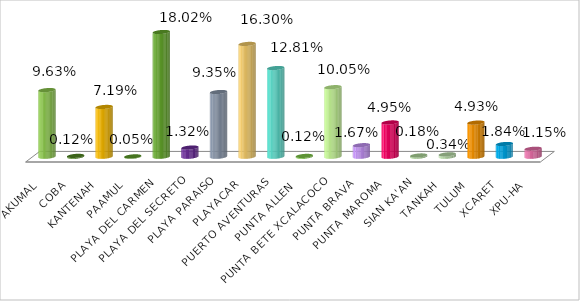
| Category | INVENTARIO DE ESTABLECIMIENTOS DE HOSPEDAJE |
|---|---|
| AKUMAL | 0.096 |
| COBA | 0.001 |
| KANTENAH | 0.072 |
| PAAMUL | 0 |
| PLAYA DEL CARMEN | 0.18 |
| PLAYA DEL SECRETO | 0.013 |
| PLAYA PARAISO | 0.093 |
| PLAYACAR | 0.163 |
| PUERTO AVENTURAS | 0.128 |
| PUNTA ALLEN  | 0.001 |
| PUNTA BETE XCALACOCO | 0.1 |
| PUNTA BRAVA | 0.017 |
| PUNTA MAROMA | 0.049 |
| SIAN KA'AN | 0.002 |
| TANKAH | 0.003 |
| TULUM | 0.049 |
| XCARET | 0.018 |
| XPU-HA | 0.011 |